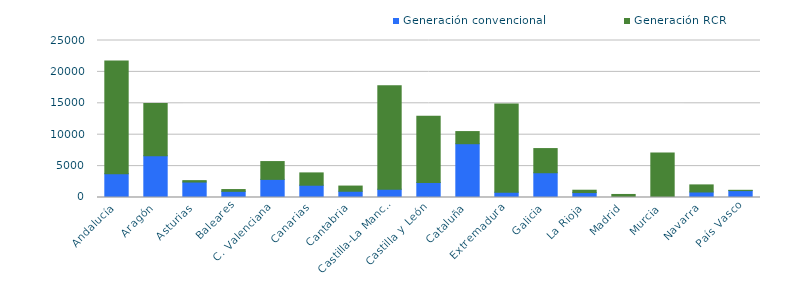
| Category | Generación convencional | Generación RCR |
|---|---|---|
| 0 | 3799.445 | 17952.56 |
| 1 | 6630.995 | 8340.1 |
| 2 | 2460.42 | 226.9 |
| 3 | 980.46 | 284.944 |
| 4 | 2885.5 | 2836.8 |
| 5 | 1954.02 | 1963.55 |
| 6 | 993.72 | 827.7 |
| 7 | 1316.7 | 16483.63 |
| 8 | 2397 | 10524.165 |
| 9 | 8564.21 | 1933.204 |
| 10 | 850 | 14021.3 |
| 11 | 3943.32 | 3847.8 |
| 12 | 784.7 | 374.2 |
| 13 | 0 | 485.38 |
| 14 | 0 | 7104.32 |
| 15 | 878.46 | 1128.159 |
| 16 | 1100 | 47 |